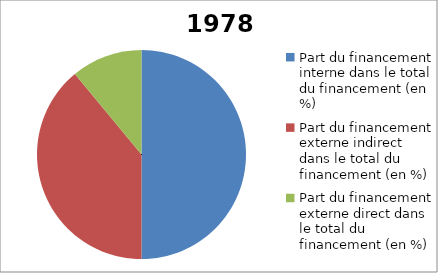
| Category | 1978 |
|---|---|
| Part du financement interne dans le total du financement (en %) | 50 |
| Part du financement externe indirect dans le total du financement (en %) | 39 |
| Part du financement externe direct dans le total du financement (en %) | 11 |